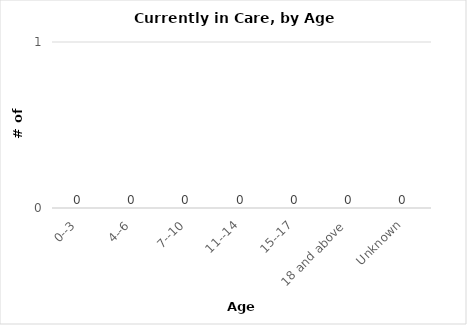
| Category | # |
|---|---|
| 0--3 | 0 |
| 4--6 | 0 |
| 7--10 | 0 |
| 11--14 | 0 |
| 15--17 | 0 |
| 18 and above  | 0 |
| Unknown | 0 |